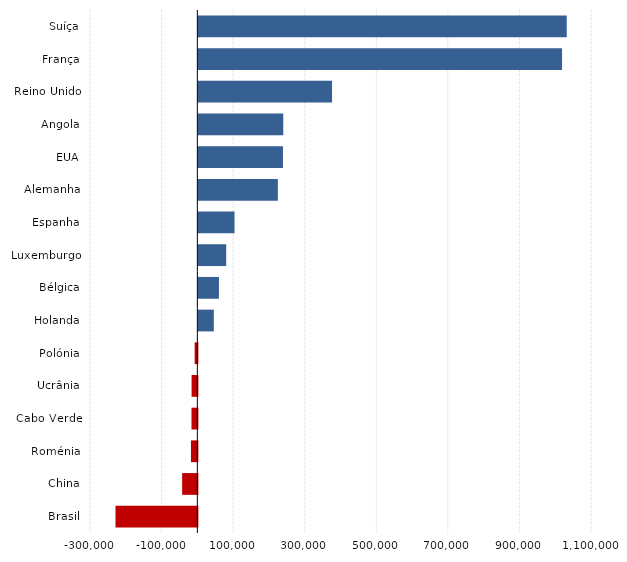
| Category | Series 0 |
|---|---|
| Suíça | 1029420 |
| França | 1016320 |
| Reino Unido | 373590 |
| Angola | 237320 |
| EUA | 236450 |
| Alemanha | 222130 |
| Espanha | 101080 |
| Luxemburgo | 77790 |
| Bélgica | 57470 |
| Holanda | 43190 |
| Polónia | -7560 |
| Ucrânia | -16110 |
| Cabo Verde | -16400 |
| Roménia | -17960 |
| China | -42550 |
| Brasil | -228750 |